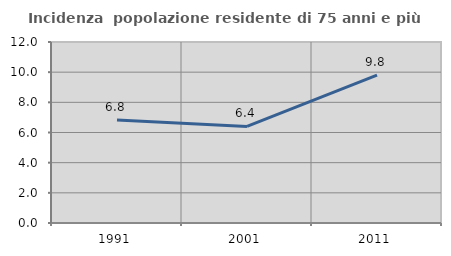
| Category | Incidenza  popolazione residente di 75 anni e più |
|---|---|
| 1991.0 | 6.83 |
| 2001.0 | 6.406 |
| 2011.0 | 9.802 |